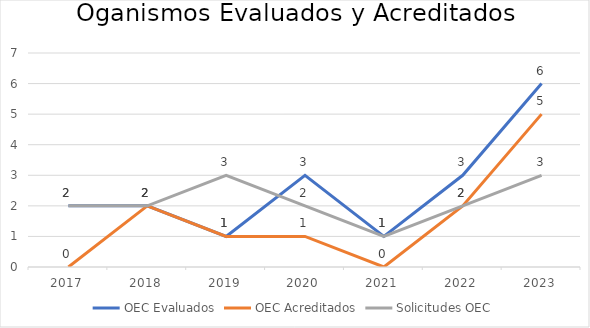
| Category | OEC Evaluados | OEC Acreditados | Solicitudes OEC |
|---|---|---|---|
| 2017.0 | 2 | 0 | 2 |
| 2018.0 | 2 | 2 | 2 |
| 2019.0 | 1 | 1 | 3 |
| 2020.0 | 3 | 1 | 2 |
| 2021.0 | 1 | 0 | 1 |
| 2022.0 | 3 | 2 | 2 |
| 2023.0 | 6 | 5 | 3 |